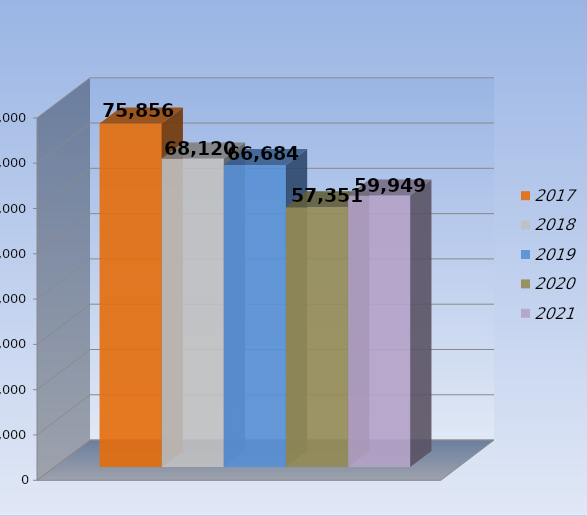
| Category | 2017 | 2018 | 2019 | 2020 | 2021 |
|---|---|---|---|---|---|
| 0 | 75856 | 68120 | 66684 | 57351 | 59949 |